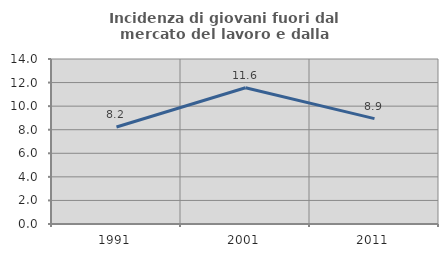
| Category | Incidenza di giovani fuori dal mercato del lavoro e dalla formazione  |
|---|---|
| 1991.0 | 8.235 |
| 2001.0 | 11.556 |
| 2011.0 | 8.939 |